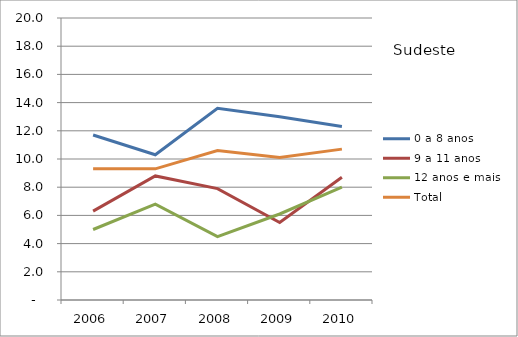
| Category | 0 a 8 anos | 9 a 11 anos | 12 anos e mais | Total |
|---|---|---|---|---|
| 2006.0 | 11.7 | 6.3 | 5 | 9.3 |
| 2007.0 | 10.3 | 8.8 | 6.8 | 9.3 |
| 2008.0 | 13.6 | 7.9 | 4.5 | 10.6 |
| 2009.0 | 13 | 5.5 | 6.1 | 10.1 |
| 2010.0 | 12.3 | 8.7 | 8 | 10.7 |